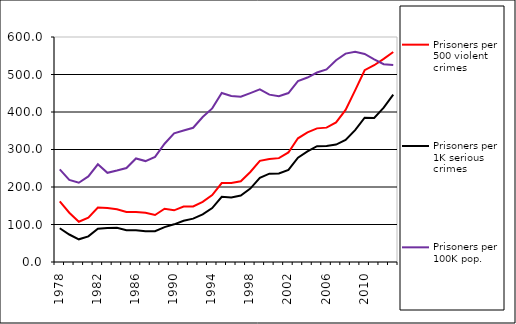
| Category | Prisoners per 500 violent crimes | Prisoners per 1K serious crimes | Prisoners per 100K pop. |
|---|---|---|---|
| 1978.0 | 161.441 | 90.069 | 247.184 |
| 1979.0 | 131.34 | 73.299 | 219.041 |
| 1980.0 | 107.397 | 60.526 | 211.255 |
| 1981.0 | 118.236 | 68.307 | 228.212 |
| 1982.0 | 145.267 | 88.88 | 260.551 |
| 1983.0 | 143.801 | 90.626 | 237.762 |
| 1984.0 | 140.438 | 91.105 | 243.796 |
| 1985.0 | 133.13 | 84.926 | 250.589 |
| 1986.0 | 133.159 | 84.734 | 276.043 |
| 1987.0 | 131.365 | 82.025 | 269.151 |
| 1988.0 | 125.344 | 82.123 | 280.205 |
| 1989.0 | 142.152 | 92.981 | 315.413 |
| 1990.0 | 137.835 | 100.448 | 343.023 |
| 1991.0 | 147.959 | 109.858 | 350.463 |
| 1992.0 | 148.271 | 115.63 | 357.985 |
| 1993.0 | 160.276 | 127.111 | 386.6 |
| 1994.0 | 178.585 | 143.833 | 409.611 |
| 1995.0 | 210.486 | 173.847 | 450.84 |
| 1996.0 | 210.591 | 172.098 | 442.681 |
| 1997.0 | 215.252 | 177.439 | 440.658 |
| 1998.0 | 239.948 | 195.829 | 450.476 |
| 1999.0 | 269.652 | 224.192 | 460.544 |
| 2000.0 | 274.771 | 235.626 | 446.229 |
| 2001.0 | 276.958 | 236.024 | 442.207 |
| 2002.0 | 292.12 | 245.794 | 450.547 |
| 2003.0 | 329.912 | 278.048 | 482.394 |
| 2004.0 | 345.565 | 294.844 | 491.964 |
| 2005.0 | 356.336 | 308.75 | 505.206 |
| 2006.0 | 358.305 | 309.091 | 513.403 |
| 2007.0 | 372.375 | 313.072 | 538.15 |
| 2008.0 | 405.465 | 325.315 | 555.735 |
| 2009.0 | 457.61 | 351.747 | 560.552 |
| 2010.0 | 511.459 | 384.768 | 554.78 |
| 2011.0 | 524.731 | 384.005 | 540.057 |
| 2012.0 | 541.68 | 411.589 | 527.568 |
| 2013.0 | 559.977 | 446.186 | 525.645 |